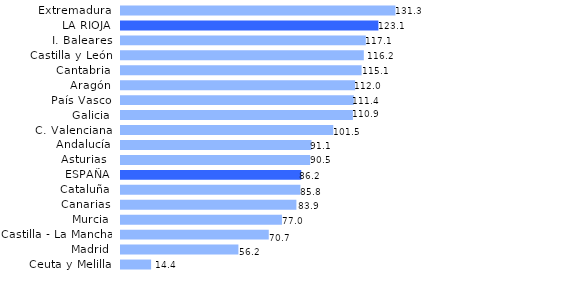
| Category | Series 0 |
|---|---|
| Ceuta y Melilla | 14.407 |
| Madrid | 56.167 |
| Castilla - La Mancha | 70.685 |
| Murcia | 76.987 |
| Canarias | 83.9 |
| Cataluña | 85.801 |
| ESPAÑA | 86.23 |
| Asturias  | 90.5 |
| Andalucía | 91.115 |
| C. Valenciana | 101.542 |
| Galicia | 110.922 |
| País Vasco | 111.356 |
| Aragón | 111.996 |
| Cantabria | 115.088 |
| Castilla y León | 116.153 |
| I. Baleares | 117.1 |
| LA RIOJA | 123.142 |
| Extremadura | 131.281 |